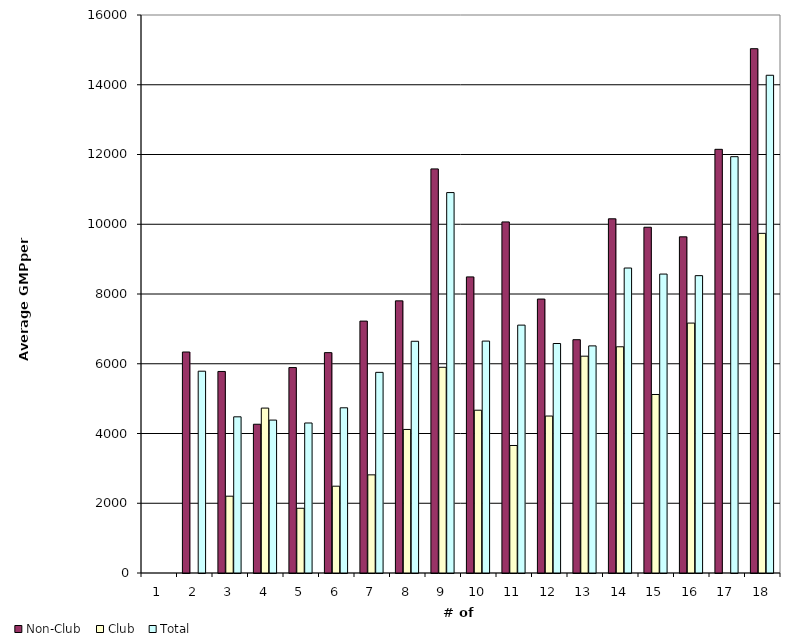
| Category | Non-Club | Club | Total |
|---|---|---|---|
| 1.0 | 0 | 0 | 0 |
| 2.0 | 6336.629 | 0 | 5786.716 |
| 3.0 | 5778.993 | 2202.492 | 4478.447 |
| 4.0 | 4265.266 | 4728.61 | 4384.412 |
| 5.0 | 5890.688 | 1856.058 | 4301.288 |
| 6.0 | 6318.766 | 2489.083 | 4736.94 |
| 7.0 | 7223.04 | 2814.325 | 5753.468 |
| 8.0 | 7803.56 | 4116.068 | 6644.634 |
| 9.0 | 11586.553 | 5898.679 | 10908.183 |
| 10.0 | 8490.481 | 4667.579 | 6649.825 |
| 11.0 | 10066.577 | 3655.985 | 7107.842 |
| 12.0 | 7855.254 | 4500.574 | 6580.476 |
| 13.0 | 6689.795 | 6216.861 | 6512.445 |
| 14.0 | 10156.261 | 6486.644 | 8744.87 |
| 15.0 | 9914.101 | 5118.408 | 8571.307 |
| 16.0 | 9639.073 | 7165.985 | 8526.184 |
| 17.0 | 12148.449 | 0 | 11937.455 |
| 18.0 | 15033.757 | 9739.065 | 14272.192 |